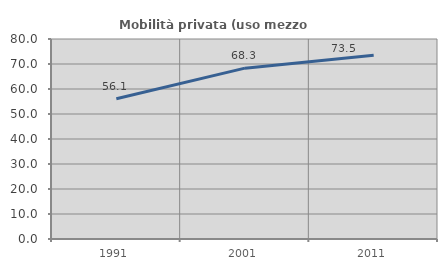
| Category | Mobilità privata (uso mezzo privato) |
|---|---|
| 1991.0 | 56.113 |
| 2001.0 | 68.342 |
| 2011.0 | 73.477 |